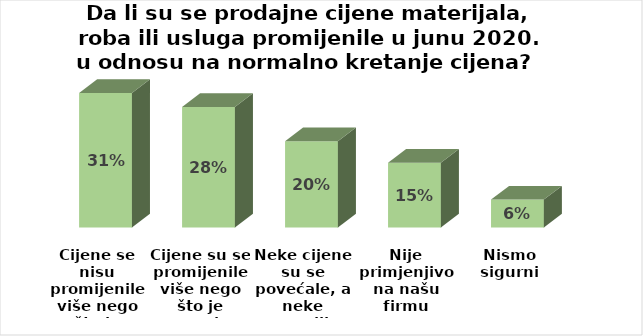
| Category | Series 0 |
|---|---|
| Cijene se nisu promijenile više nego što je normalno | 106 |
| Cijene su se promijenile više nego što je normalno | 95 |
| Neke cijene su se povećale, a neke smanjile | 68 |
| Nije primjenjivo na našu firmu | 51 |
| Nismo sigurni | 22 |